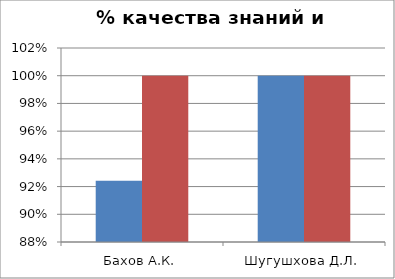
| Category | Series 0 | 2 |
|---|---|---|
| Бахов А.К. | 0.924 | 1 |
| Шугушхова Д.Л. | 1 | 1 |